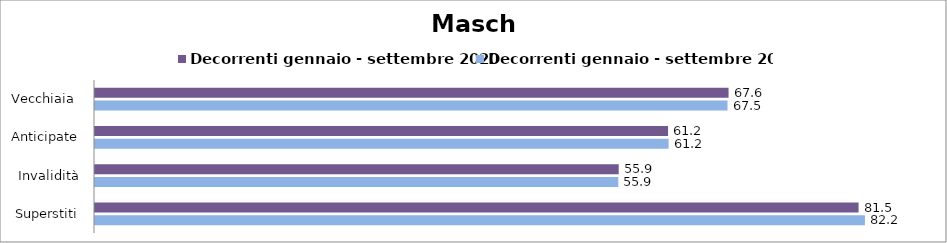
| Category | Decorrenti gennaio - settembre 2020 | Decorrenti gennaio - settembre 2021 |
|---|---|---|
| Vecchiaia  | 67.64 | 67.53 |
| Anticipate | 61.18 | 61.24 |
| Invalidità | 55.91 | 55.87 |
| Superstiti | 81.52 | 82.2 |